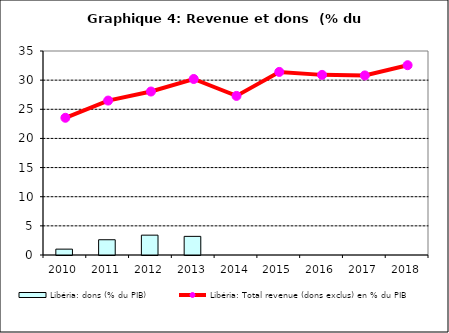
| Category | Libéria: dons (% du PIB) |
|---|---|
| 2010.0 | 1.007 |
| 2011.0 | 2.619 |
| 2012.0 | 3.407 |
| 2013.0 | 3.196 |
| 2014.0 | 0 |
| 2015.0 | 0 |
| 2016.0 | 0 |
| 2017.0 | 0 |
| 2018.0 | 0 |